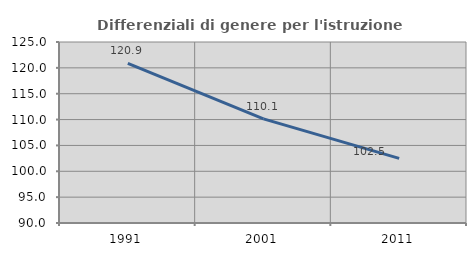
| Category | Differenziali di genere per l'istruzione superiore |
|---|---|
| 1991.0 | 120.867 |
| 2001.0 | 110.136 |
| 2011.0 | 102.49 |